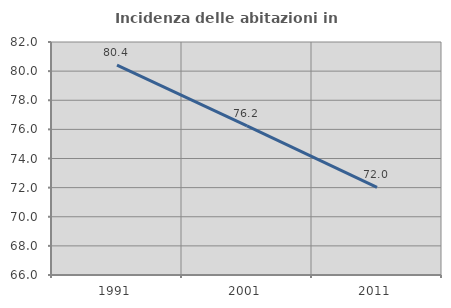
| Category | Incidenza delle abitazioni in proprietà  |
|---|---|
| 1991.0 | 80.412 |
| 2001.0 | 76.241 |
| 2011.0 | 72.015 |